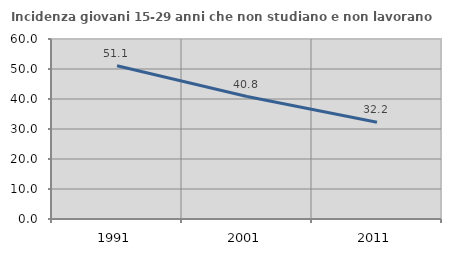
| Category | Incidenza giovani 15-29 anni che non studiano e non lavorano  |
|---|---|
| 1991.0 | 51.111 |
| 2001.0 | 40.806 |
| 2011.0 | 32.223 |